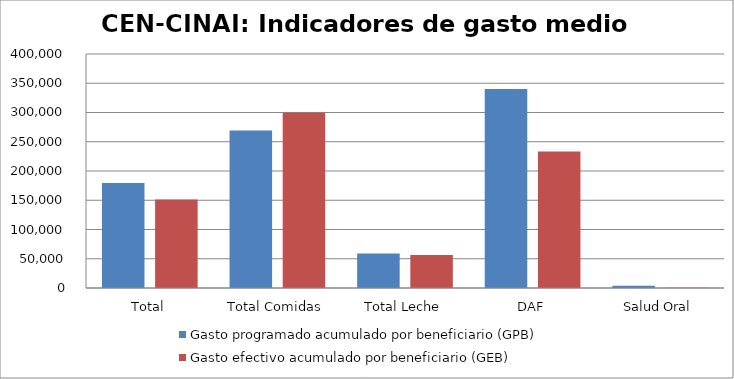
| Category | Gasto programado acumulado por beneficiario (GPB)  | Gasto efectivo acumulado por beneficiario (GEB)  |
|---|---|---|
| Total | 179288.996 | 151298.286 |
| Total Comidas | 269317.499 | 299748.809 |
| Total Leche | 59119.464 | 56218.04 |
| DAF | 340132.813 | 233290.543 |
| Salud Oral | 3920.5 | 488.864 |